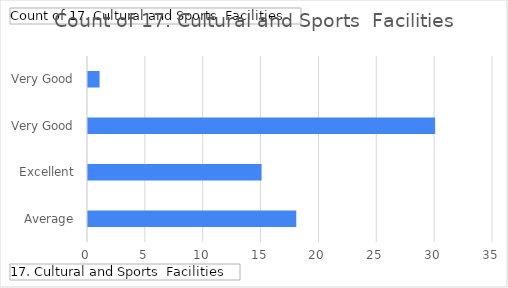
| Category | Total |
|---|---|
| Average | 18 |
| Excellent | 15 |
| Very Good | 30 |
| Very Good, Average | 1 |